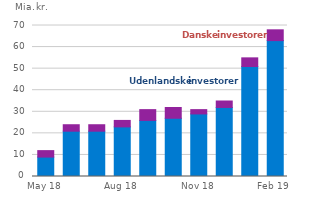
| Category | Danmark | Udlandet |
|---|---|---|
| 2018-05-01 | 9 | 3 |
| 2018-06-01 | 21 | 3 |
| 2018-07-01 | 21 | 3 |
| 2018-08-01 | 23 | 3 |
| 2018-09-01 | 26 | 5 |
| 2018-10-01 | 27 | 5 |
| 2018-11-01 | 29 | 2 |
| 2018-12-01 | 32 | 3 |
| 2019-01-01 | 51 | 4 |
| 2019-02-01 | 63 | 5 |